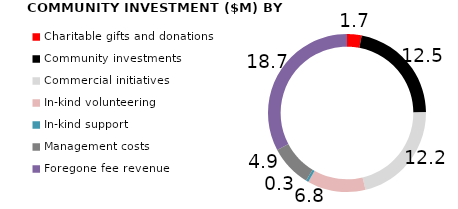
| Category | Series 0 |
|---|---|
| Charitable gifts and donations | 1.7 |
| Community investments | 12.5 |
| Commercial initiatives | 12.2 |
| In-kind volunteering | 6.8 |
| In-kind support | 0.3 |
| Management costs | 4.9 |
| Foregone fee revenue | 18.7 |